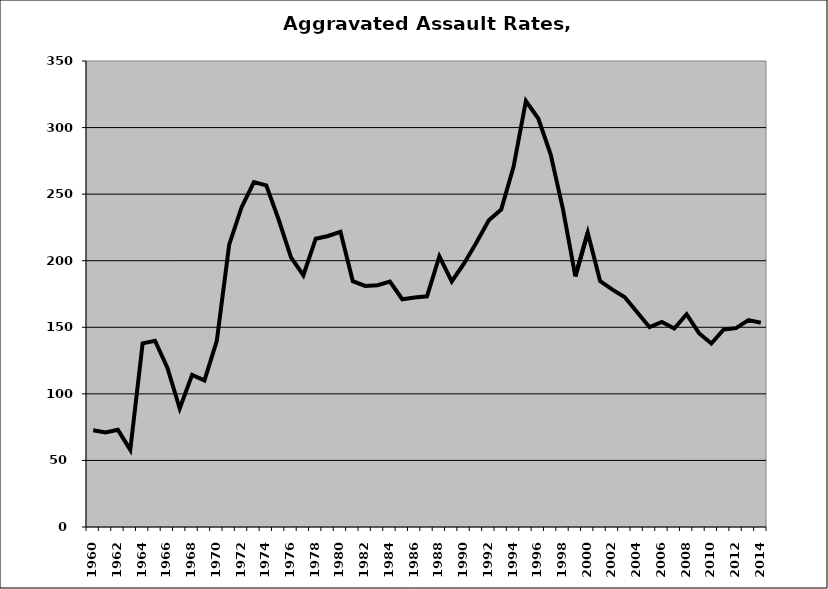
| Category | Aggravated Assault |
|---|---|
| 1960.0 | 72.631 |
| 1961.0 | 70.926 |
| 1962.0 | 72.954 |
| 1963.0 | 57.904 |
| 1964.0 | 137.943 |
| 1965.0 | 139.94 |
| 1966.0 | 119.639 |
| 1967.0 | 89.012 |
| 1968.0 | 114.261 |
| 1969.0 | 110.114 |
| 1970.0 | 139.834 |
| 1971.0 | 211.995 |
| 1972.0 | 239.991 |
| 1973.0 | 259.053 |
| 1974.0 | 256.54 |
| 1975.0 | 230.946 |
| 1976.0 | 202.506 |
| 1977.0 | 189.075 |
| 1978.0 | 216.556 |
| 1979.0 | 218.579 |
| 1980.0 | 221.741 |
| 1981.0 | 184.585 |
| 1982.0 | 181.066 |
| 1983.0 | 181.639 |
| 1984.0 | 184.257 |
| 1985.0 | 171.068 |
| 1986.0 | 172.419 |
| 1987.0 | 173.295 |
| 1988.0 | 203.274 |
| 1989.0 | 184.395 |
| 1990.0 | 197.962 |
| 1991.0 | 213.696 |
| 1992.0 | 230.413 |
| 1993.0 | 238.441 |
| 1994.0 | 270.513 |
| 1995.0 | 319.911 |
| 1996.0 | 306.811 |
| 1997.0 | 279.897 |
| 1998.0 | 238.626 |
| 1999.0 | 188.217 |
| 2000.0 | 221.116 |
| 2001.0 | 184.738 |
| 2002.0 | 178.287 |
| 2003.0 | 172.553 |
| 2004.0 | 161.233 |
| 2005.0 | 150.078 |
| 2006.0 | 153.992 |
| 2007.0 | 149.069 |
| 2008.0 | 159.818 |
| 2009.0 | 145.563 |
| 2010.0 | 137.802 |
| 2011.0 | 148.382 |
| 2012.0 | 149.341 |
| 2013.0 | 155.37 |
| 2014.0 | 153.369 |